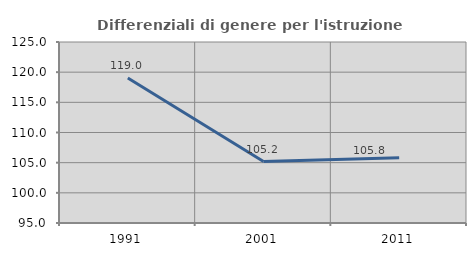
| Category | Differenziali di genere per l'istruzione superiore |
|---|---|
| 1991.0 | 119.022 |
| 2001.0 | 105.192 |
| 2011.0 | 105.825 |